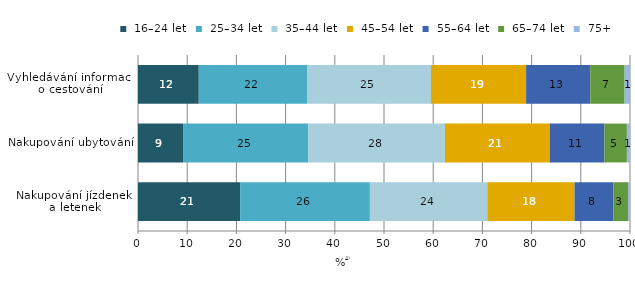
| Category |  16–24 let |  25–34 let |  35–44 let |  45–54 let |  55–64 let |  65–74 let |  75+ |
|---|---|---|---|---|---|---|---|
| Nakupování jízdenek
 a letenek | 20.759 | 26.374 | 23.863 | 17.728 | 7.896 | 2.986 | 0.395 |
| Nakupování ubytování | 9.158 | 25.445 | 27.78 | 21.289 | 11.116 | 4.575 | 0.637 |
| Vyhledávání informací
 o cestování | 12.349 | 22.01 | 25.186 | 19.34 | 13.043 | 6.98 | 1.093 |